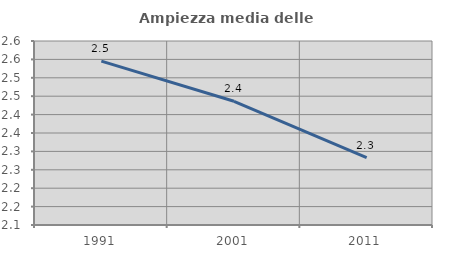
| Category | Ampiezza media delle famiglie |
|---|---|
| 1991.0 | 2.545 |
| 2001.0 | 2.436 |
| 2011.0 | 2.283 |